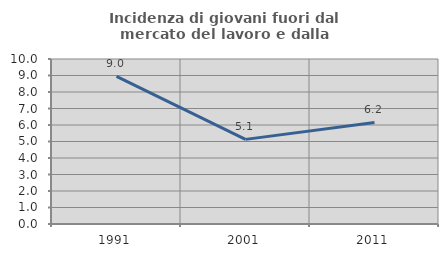
| Category | Incidenza di giovani fuori dal mercato del lavoro e dalla formazione  |
|---|---|
| 1991.0 | 8.953 |
| 2001.0 | 5.128 |
| 2011.0 | 6.154 |